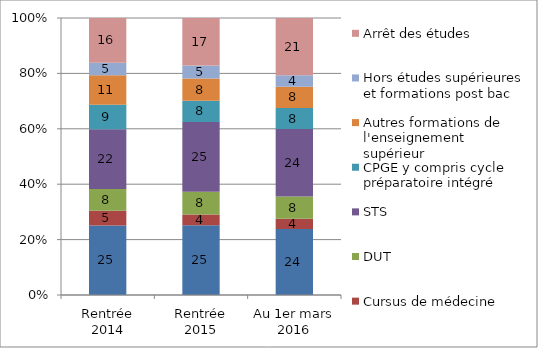
| Category | Licence | Cursus de médecine | DUT | STS | CPGE y compris cycle préparatoire intégré | Autres formations de l'enseignement supérieur | Hors études supérieures et formations post bac | Arrêt des études |
|---|---|---|---|---|---|---|---|---|
| Rentrée 2014 | 25.1 | 5.3 | 7.9 | 21.5 | 8.9 | 10.6 | 4.5 | 16.2 |
| Rentrée 2015 | 25.2 | 3.8 | 8.2 | 25.2 | 7.7 | 8 | 4.7 | 17.1 |
| Au 1er mars 2016 | 23.8 | 3.7 | 8.1 | 24.3 | 7.6 | 7.7 | 4.1 | 20.7 |